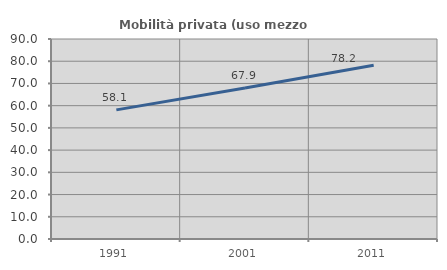
| Category | Mobilità privata (uso mezzo privato) |
|---|---|
| 1991.0 | 58.108 |
| 2001.0 | 67.925 |
| 2011.0 | 78.182 |